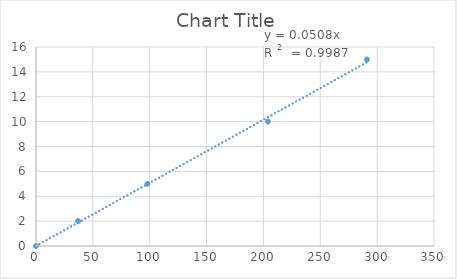
| Category | Series 0 |
|---|---|
| 0.0 | 0 |
| 37.0 | 2 |
| 98.0 | 5 |
| 204.0 | 10 |
| 291.0 | 15 |